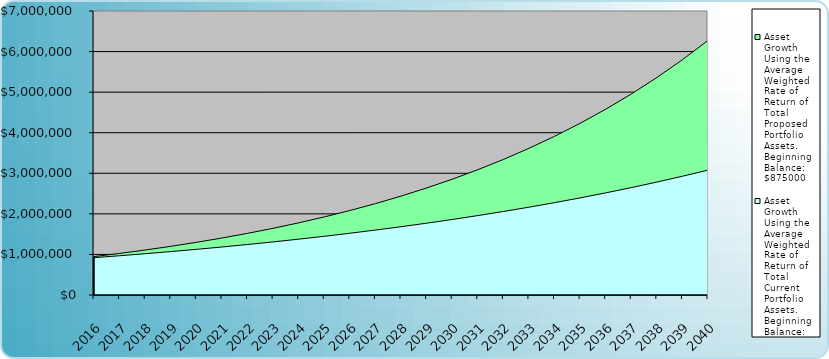
| Category | Asset Growth Using the Average Weighted Rate of Return of Total Proposed Portfolio Assets. Beginning Balance: $875000 | Asset Growth Using the Average Weighted Rate of Return of Total Current Portfolio Assets. Beginning Balance: $875000 |
|---|---|---|
| 2016.0 | 946740 | 920150 |
| 2017.0 | 1024361.86 | 967629.74 |
| 2018.0 | 1108347.826 | 1017559.435 |
| 2019.0 | 1199219.681 | 1070065.501 |
| 2020.0 | 1297541.989 | 1125280.881 |
| 2021.0 | 1403925.603 | 1183345.375 |
| 2022.0 | 1519031.458 | 1244405.996 |
| 2023.0 | 1643574.677 | 1308617.345 |
| 2024.0 | 1778329.017 | 1376142.001 |
| 2025.0 | 1924131.672 | 1447150.928 |
| 2026.0 | 2081888.479 | 1521823.916 |
| 2027.0 | 2252579.541 | 1600350.03 |
| 2028.0 | 2437265.32 | 1682928.091 |
| 2029.0 | 2637093.222 | 1769767.181 |
| 2030.0 | 2853304.728 | 1861087.167 |
| 2031.0 | 3087243.106 | 1957119.265 |
| 2032.0 | 3340361.758 | 2058106.619 |
| 2033.0 | 3614233.247 | 2164304.921 |
| 2034.0 | 3910559.068 | 2275983.055 |
| 2035.0 | 4231180.219 | 2393423.78 |
| 2036.0 | 4578088.641 | 2516924.447 |
| 2037.0 | 4953439.588 | 2646797.749 |
| 2038.0 | 5359565.024 | 2783372.513 |
| 2039.0 | 5798988.103 | 2926994.534 |
| 2040.0 | 6274438.854 | 3078027.452 |